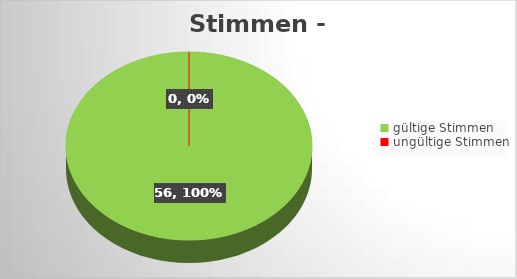
| Category | Series 0 |
|---|---|
| gültige Stimmen | 56 |
| ungültige Stimmen | 0 |